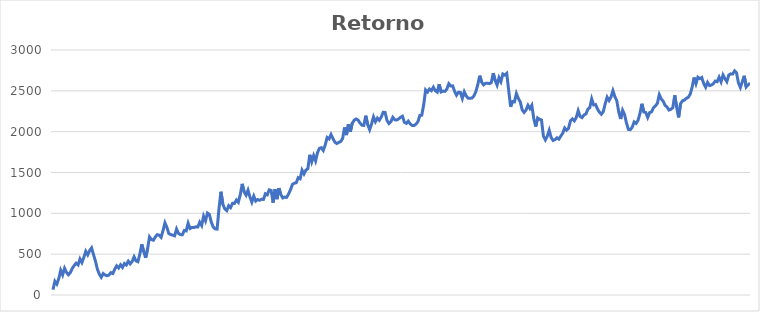
| Category | Retorno Ac. |
|---|---|
| 0 | 65.09 |
| 1 | 168.5 |
| 2 | 133.48 |
| 3 | 199.51 |
| 4 | 302.08 |
| 5 | 245.34 |
| 6 | 327.48 |
| 7 | 277.31 |
| 8 | 247.61 |
| 9 | 274.64 |
| 10 | 325.58 |
| 11 | 361.49 |
| 12 | 389.78 |
| 13 | 368.89 |
| 14 | 440.94 |
| 15 | 397.05 |
| 16 | 461.69 |
| 17 | 535.13 |
| 18 | 491.47 |
| 19 | 543.21 |
| 20 | 576.89 |
| 21 | 494.08 |
| 22 | 414.84 |
| 23 | 316.58 |
| 24 | 255.64 |
| 25 | 216.83 |
| 26 | 263.07 |
| 27 | 245.75 |
| 28 | 235.78 |
| 29 | 245.04 |
| 30 | 274.07 |
| 31 | 263.28 |
| 32 | 316.39 |
| 33 | 356.86 |
| 34 | 331.18 |
| 35 | 369.75 |
| 36 | 338.19 |
| 37 | 385.2 |
| 38 | 367.67 |
| 39 | 413.96 |
| 40 | 380.96 |
| 41 | 410.51 |
| 42 | 467.76 |
| 43 | 417.64 |
| 44 | 407.4 |
| 45 | 502.05 |
| 46 | 620.77 |
| 47 | 530.2 |
| 48 | 455.1 |
| 49 | 565.04 |
| 50 | 711.34 |
| 51 | 679.4 |
| 52 | 670.5 |
| 53 | 711.03 |
| 54 | 738.93 |
| 55 | 732.33 |
| 56 | 706.41 |
| 57 | 788.08 |
| 58 | 884.02 |
| 59 | 828.54 |
| 60 | 751.16 |
| 61 | 740.63 |
| 62 | 732.81 |
| 63 | 724.96 |
| 64 | 807.63 |
| 65 | 754.87 |
| 66 | 740.04 |
| 67 | 737.26 |
| 68 | 789.64 |
| 69 | 784.54 |
| 70 | 879.12 |
| 71 | 813.95 |
| 72 | 827.12 |
| 73 | 825.99 |
| 74 | 834.98 |
| 75 | 832.72 |
| 76 | 890.94 |
| 77 | 850.3 |
| 78 | 964.94 |
| 79 | 907.81 |
| 80 | 1003.8 |
| 81 | 987.17 |
| 82 | 891.94 |
| 83 | 832.28 |
| 84 | 810.22 |
| 85 | 806.8 |
| 86 | 1063.78 |
| 87 | 1264.26 |
| 88 | 1108.75 |
| 89 | 1054.72 |
| 90 | 1033.43 |
| 91 | 1093.37 |
| 92 | 1070.52 |
| 93 | 1122.73 |
| 94 | 1121.52 |
| 95 | 1163.47 |
| 96 | 1135.88 |
| 97 | 1227.44 |
| 98 | 1360.97 |
| 99 | 1262.8 |
| 100 | 1222.48 |
| 101 | 1283.55 |
| 102 | 1201.36 |
| 103 | 1137.52 |
| 104 | 1211.2 |
| 105 | 1150.26 |
| 106 | 1169.36 |
| 107 | 1160.48 |
| 108 | 1172.47 |
| 109 | 1169.69 |
| 110 | 1239.32 |
| 111 | 1226.71 |
| 112 | 1287.67 |
| 113 | 1279.75 |
| 114 | 1130.46 |
| 115 | 1294.16 |
| 116 | 1173.42 |
| 117 | 1308.5 |
| 118 | 1230.83 |
| 119 | 1188.48 |
| 120 | 1199.43 |
| 121 | 1195.17 |
| 122 | 1235.8 |
| 123 | 1288.16 |
| 124 | 1353.14 |
| 125 | 1369.62 |
| 126 | 1374.83 |
| 127 | 1436.51 |
| 128 | 1423.6 |
| 129 | 1528.92 |
| 130 | 1482.68 |
| 131 | 1529.26 |
| 132 | 1546.5 |
| 133 | 1716.66 |
| 134 | 1630.12 |
| 135 | 1707.75 |
| 136 | 1641.49 |
| 137 | 1742.62 |
| 138 | 1795.8 |
| 139 | 1804.28 |
| 140 | 1770.14 |
| 141 | 1836.71 |
| 142 | 1929.14 |
| 143 | 1911.42 |
| 144 | 1964.95 |
| 145 | 1915.29 |
| 146 | 1871.19 |
| 147 | 1854.79 |
| 148 | 1868.76 |
| 149 | 1879.09 |
| 150 | 1915.26 |
| 151 | 2051.51 |
| 152 | 1958.46 |
| 153 | 2090.88 |
| 154 | 2000.33 |
| 155 | 2103.87 |
| 156 | 2140.43 |
| 157 | 2155.52 |
| 158 | 2142.41 |
| 159 | 2106.03 |
| 160 | 2078.6 |
| 161 | 2076.75 |
| 162 | 2195.81 |
| 163 | 2085.12 |
| 164 | 2024.63 |
| 165 | 2095.21 |
| 166 | 2180.81 |
| 167 | 2121.71 |
| 168 | 2166.43 |
| 169 | 2139.33 |
| 170 | 2178.25 |
| 171 | 2237.77 |
| 172 | 2235.62 |
| 173 | 2137.19 |
| 174 | 2099.35 |
| 175 | 2122.56 |
| 176 | 2175.72 |
| 177 | 2146.09 |
| 178 | 2142.37 |
| 179 | 2155.78 |
| 180 | 2175.92 |
| 181 | 2189.02 |
| 182 | 2115.39 |
| 183 | 2101.28 |
| 184 | 2129.17 |
| 185 | 2095.51 |
| 186 | 2076.2 |
| 187 | 2074.3 |
| 188 | 2092.4 |
| 189 | 2122.32 |
| 190 | 2198 |
| 191 | 2201.72 |
| 192 | 2331.51 |
| 193 | 2511.64 |
| 194 | 2485.68 |
| 195 | 2522.58 |
| 196 | 2502.47 |
| 197 | 2544.31 |
| 198 | 2501.67 |
| 199 | 2484.36 |
| 200 | 2581.42 |
| 201 | 2486.11 |
| 202 | 2497.58 |
| 203 | 2493.07 |
| 204 | 2521.6 |
| 205 | 2587.51 |
| 206 | 2559.23 |
| 207 | 2560.82 |
| 208 | 2493.64 |
| 209 | 2446.58 |
| 210 | 2482.47 |
| 211 | 2480.56 |
| 212 | 2406.62 |
| 213 | 2488.46 |
| 214 | 2437.49 |
| 215 | 2410.1 |
| 216 | 2409.11 |
| 217 | 2411.78 |
| 218 | 2437.54 |
| 219 | 2489.91 |
| 220 | 2574.39 |
| 221 | 2685.45 |
| 222 | 2607.09 |
| 223 | 2573.29 |
| 224 | 2591.34 |
| 225 | 2594.35 |
| 226 | 2588.68 |
| 227 | 2600.33 |
| 228 | 2715.93 |
| 229 | 2626.96 |
| 230 | 2570.42 |
| 231 | 2661.16 |
| 232 | 2612.37 |
| 233 | 2706.19 |
| 234 | 2692.68 |
| 235 | 2714.3 |
| 236 | 2509.09 |
| 237 | 2305.46 |
| 238 | 2368.62 |
| 239 | 2365.22 |
| 240 | 2467.77 |
| 241 | 2407.42 |
| 242 | 2364.69 |
| 243 | 2267.03 |
| 244 | 2235.99 |
| 245 | 2265.15 |
| 246 | 2323.15 |
| 247 | 2282.37 |
| 248 | 2322.48 |
| 249 | 2160.23 |
| 250 | 2063.28 |
| 251 | 2168 |
| 252 | 2151.56 |
| 253 | 2143.22 |
| 254 | 1945.14 |
| 255 | 1899.1 |
| 256 | 1944.54 |
| 257 | 2017.56 |
| 258 | 1928.51 |
| 259 | 1892.56 |
| 260 | 1902.45 |
| 261 | 1925.55 |
| 262 | 1909.1 |
| 263 | 1945.86 |
| 264 | 1980.91 |
| 265 | 2045.05 |
| 266 | 2017.57 |
| 267 | 2042.77 |
| 268 | 2131.83 |
| 269 | 2156.51 |
| 270 | 2132.03 |
| 271 | 2172.66 |
| 272 | 2257.23 |
| 273 | 2186.35 |
| 274 | 2171.68 |
| 275 | 2204.46 |
| 276 | 2215.61 |
| 277 | 2275.4 |
| 278 | 2293.42 |
| 279 | 2401.28 |
| 280 | 2327.38 |
| 281 | 2332.47 |
| 282 | 2277.75 |
| 283 | 2239.38 |
| 284 | 2213.52 |
| 285 | 2245.03 |
| 286 | 2342.36 |
| 287 | 2422.02 |
| 288 | 2381.5 |
| 289 | 2424.4 |
| 290 | 2501.93 |
| 291 | 2428.47 |
| 292 | 2380.06 |
| 293 | 2240.71 |
| 294 | 2155.02 |
| 295 | 2262.29 |
| 296 | 2210.12 |
| 297 | 2107.61 |
| 298 | 2028 |
| 299 | 2024.29 |
| 300 | 2055.28 |
| 301 | 2119.77 |
| 302 | 2101.58 |
| 303 | 2138.94 |
| 304 | 2223.98 |
| 305 | 2341.47 |
| 306 | 2241.21 |
| 307 | 2234.91 |
| 308 | 2173.88 |
| 309 | 2232.81 |
| 310 | 2242.94 |
| 311 | 2293.45 |
| 312 | 2314.99 |
| 313 | 2346.13 |
| 314 | 2453.58 |
| 315 | 2401.95 |
| 316 | 2373.6 |
| 317 | 2323.63 |
| 318 | 2301.38 |
| 319 | 2264.76 |
| 320 | 2274.23 |
| 321 | 2293.44 |
| 322 | 2445.32 |
| 323 | 2299.25 |
| 324 | 2174.92 |
| 325 | 2341.47 |
| 326 | 2377.69 |
| 327 | 2385.04 |
| 328 | 2408.24 |
| 329 | 2420.6 |
| 330 | 2457.82 |
| 331 | 2542.88 |
| 332 | 2662.99 |
| 333 | 2586.7 |
| 334 | 2667.29 |
| 335 | 2649.33 |
| 336 | 2663.54 |
| 337 | 2590.37 |
| 338 | 2544.11 |
| 339 | 2603.49 |
| 340 | 2564.04 |
| 341 | 2570.95 |
| 342 | 2587.61 |
| 343 | 2620.02 |
| 344 | 2611.89 |
| 345 | 2666.57 |
| 346 | 2610.39 |
| 347 | 2694.62 |
| 348 | 2649.7 |
| 349 | 2612.96 |
| 350 | 2693.72 |
| 351 | 2707.89 |
| 352 | 2705.53 |
| 353 | 2744 |
| 354 | 2720.37 |
| 355 | 2596.35 |
| 356 | 2540.61 |
| 357 | 2609.98 |
| 358 | 2683.95 |
| 359 | 2547.27 |
| 360 | 2573.58 |
| 361 | 2593.93 |